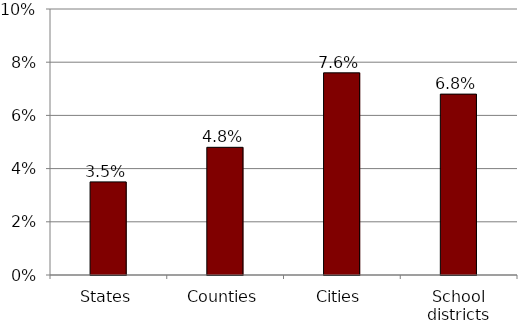
| Category | Series 0 |
|---|---|
| States | 0.035 |
| Counties | 0.048 |
| Cities | 0.076 |
| School districts | 0.068 |